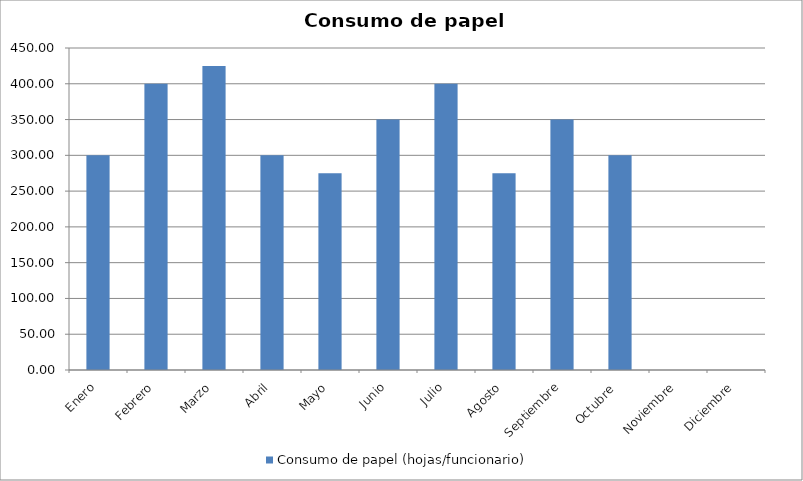
| Category | Consumo de papel (hojas/funcionario) |
|---|---|
| Enero | 300 |
| Febrero | 400 |
| Marzo | 425 |
| Abril | 300 |
| Mayo | 275 |
| Junio | 350 |
| Julio | 400 |
| Agosto | 275 |
| Septiembre | 350 |
| Octubre  | 300 |
| Noviembre | 0 |
| Diciembre | 0 |